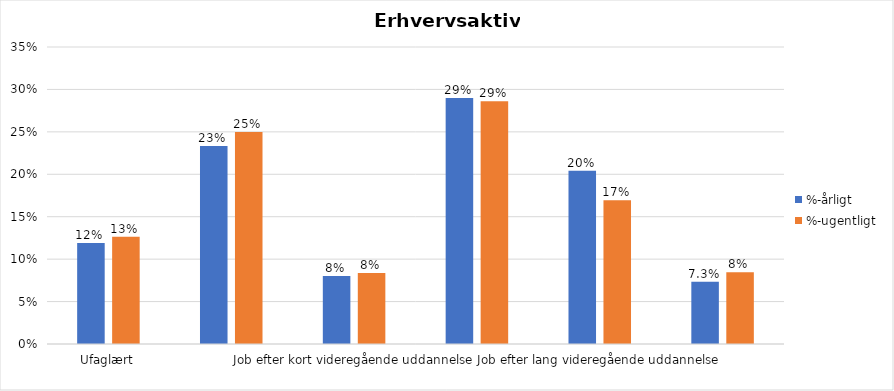
| Category | %-årligt | %-ugentligt |
|---|---|---|
| Ufaglært | 0.119 | 0.126 |
| Erhvervsfagligt job | 0.233 | 0.25 |
| Job efter kort videregående uddannelse | 0.08 | 0.084 |
| Job efter mellemlang videregående uddannelse | 0.29 | 0.286 |
| Job efter lang videregående uddannelse | 0.204 | 0.169 |
| Selvstændig | 0.073 | 0.085 |